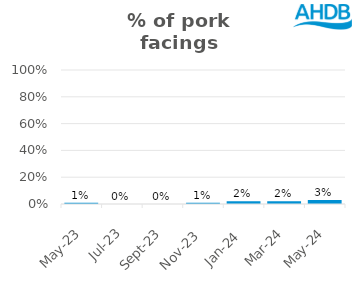
| Category | Pork |
|---|---|
| 2023-05-01 | 0.01 |
| 2023-07-01 | 0 |
| 2023-09-01 | 0 |
| 2023-11-01 | 0.01 |
| 2024-01-01 | 0.02 |
| 2024-03-01 | 0.02 |
| 2024-05-01 | 0.03 |